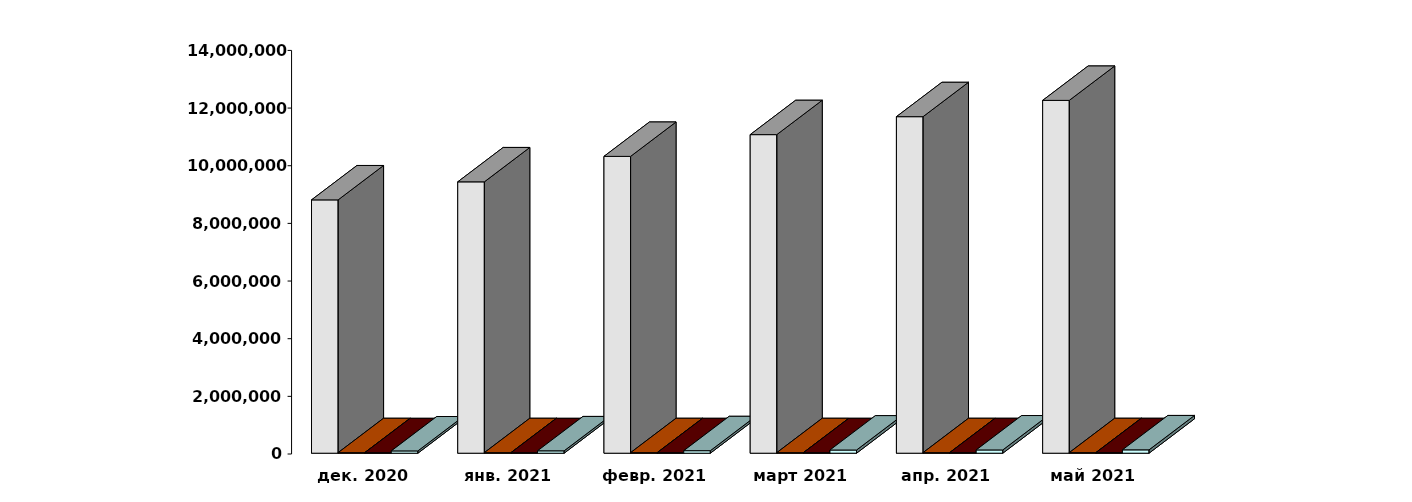
| Category | Физические лица | Юридические лица | Иностранные лица | Клиенты, передавшие свои средства в ДУ |
|---|---|---|---|---|
| 2020-12-28 | 8787077 | 19014 | 17268 | 79270 |
| 2021-01-28 | 9412672 | 19074 | 17041 | 82193 |
| 2021-02-28 | 10296032 | 19173 | 17445 | 86734 |
| 2021-03-30 | 11050505 | 19312 | 17990 | 110250 |
| 2021-04-30 | 11673527 | 19474 | 18437 | 113270 |
| 2021-05-31 | 12238639 | 19619 | 18804 | 116061 |